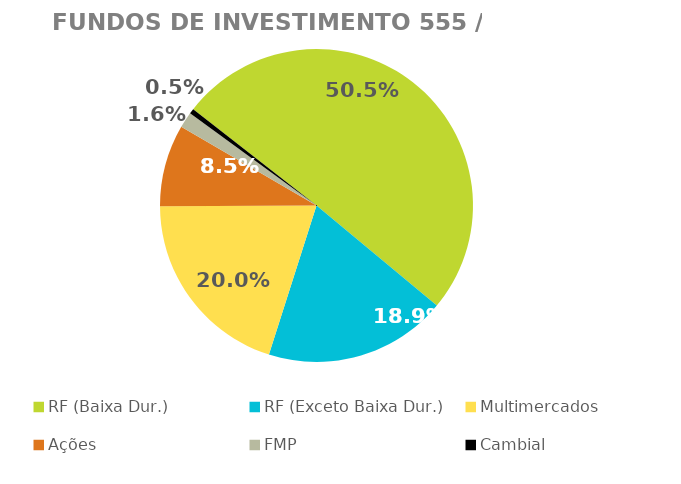
| Category | Fundos de Investimento 555 / FMP |
|---|---|
| RF (Baixa Dur.) | 0.505 |
| RF (Exceto Baixa Dur.) | 0.189 |
| Multimercados | 0.2 |
| Ações | 0.085 |
| FMP | 0.016 |
| Cambial | 0.005 |